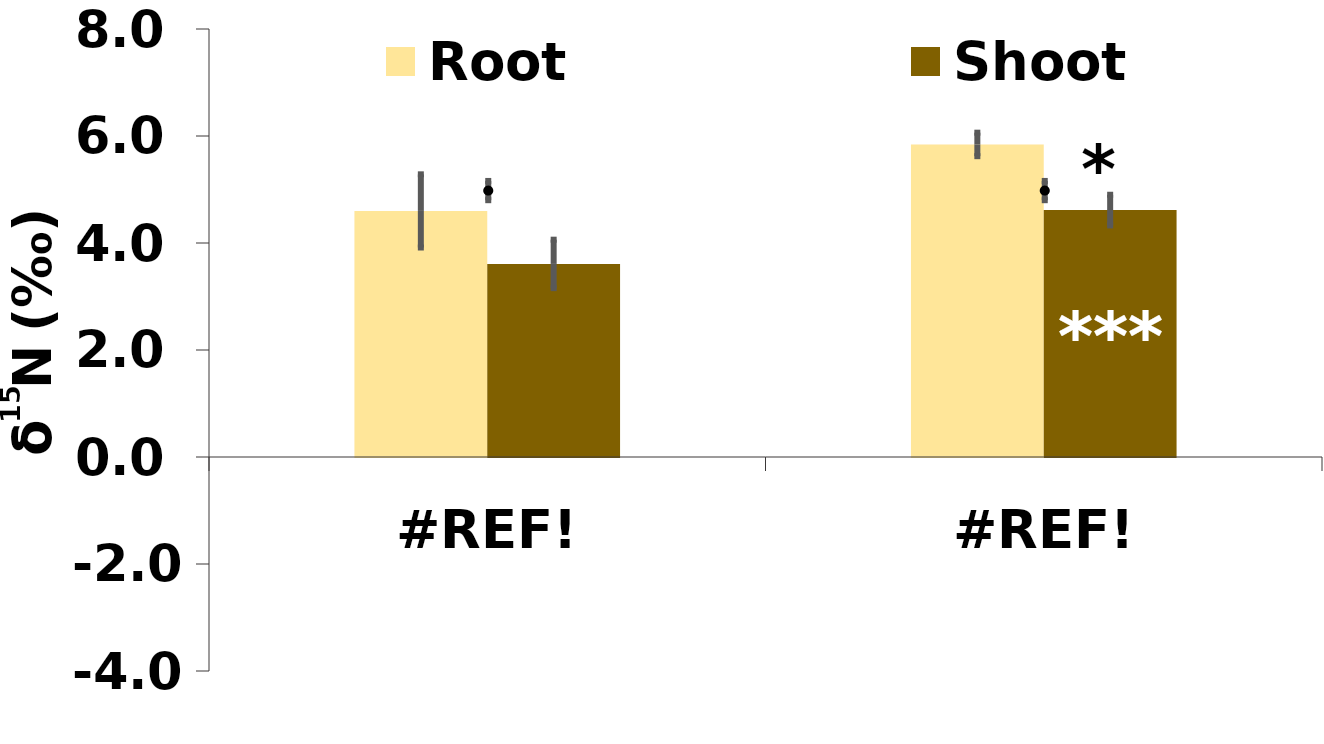
| Category | Root | Shoot |
|---|---|---|
| 0.0 | 4.6 | 3.609 |
| 0.0 | 5.842 | 4.615 |